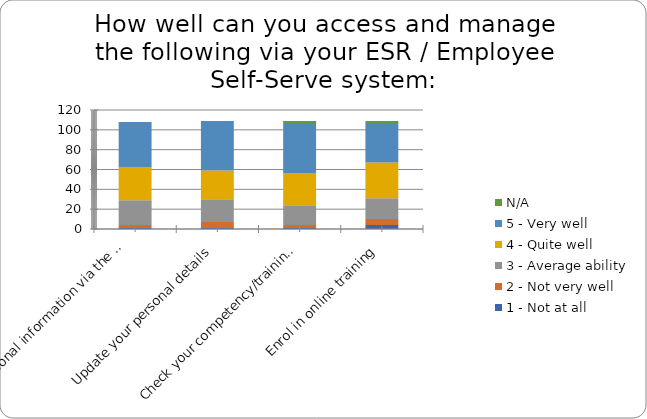
| Category | 1 - Not at all | 2 - Not very well | 3 - Average ability | 4 - Quite well | 5 - Very well | N/A |
|---|---|---|---|---|---|---|
| Personal information via the ESR / Employee Self-Serve system
(e.g. payslips, sickness absence etc.) | 1 | 3 | 25 | 33 | 46 | 0 |
| Update your personal details | 1 | 6 | 23 | 29 | 50 | 0 |
| Check your competency/training needs | 1 | 3 | 20 | 32 | 51 | 2 |
| Enrol in online training | 4 | 6 | 21 | 36 | 40 | 2 |